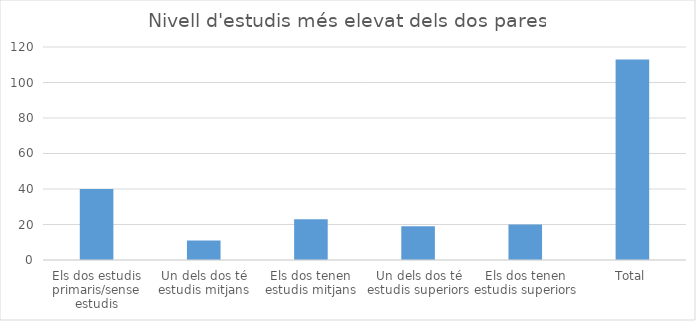
| Category | Series 0 |
|---|---|
| Els dos estudis primaris/sense estudis | 40 |
| Un dels dos té estudis mitjans | 11 |
| Els dos tenen estudis mitjans | 23 |
| Un dels dos té estudis superiors | 19 |
| Els dos tenen estudis superiors | 20 |
| Total | 113 |